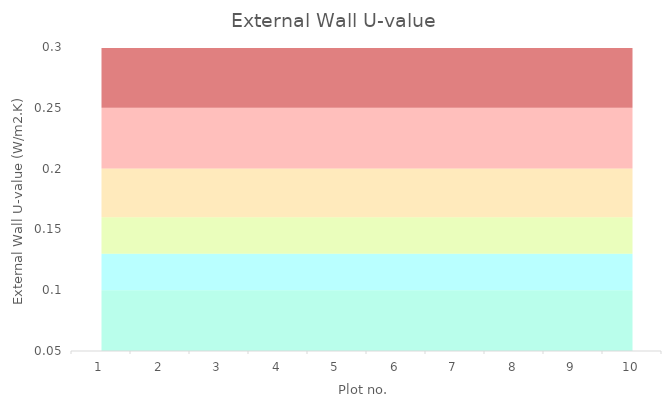
| Category | Series 0 | Series 1 | Series 2 | Series 3 | Series 4 | Series 5 |
|---|---|---|---|---|---|---|
| 0 | 0.1 | 0.03 | 0.03 | 0.04 | 0.05 | 0.05 |
| 1 | 0.1 | 0.03 | 0.03 | 0.04 | 0.05 | 0.05 |
| 2 | 0.1 | 0.03 | 0.03 | 0.04 | 0.05 | 0.05 |
| 3 | 0.1 | 0.03 | 0.03 | 0.04 | 0.05 | 0.05 |
| 4 | 0.1 | 0.03 | 0.03 | 0.04 | 0.05 | 0.05 |
| 5 | 0.1 | 0.03 | 0.03 | 0.04 | 0.05 | 0.05 |
| 6 | 0.1 | 0.03 | 0.03 | 0.04 | 0.05 | 0.05 |
| 7 | 0.1 | 0.03 | 0.03 | 0.04 | 0.05 | 0.05 |
| 8 | 0.1 | 0.03 | 0.03 | 0.04 | 0.05 | 0.05 |
| 9 | 0.1 | 0.03 | 0.03 | 0.04 | 0.05 | 0.05 |